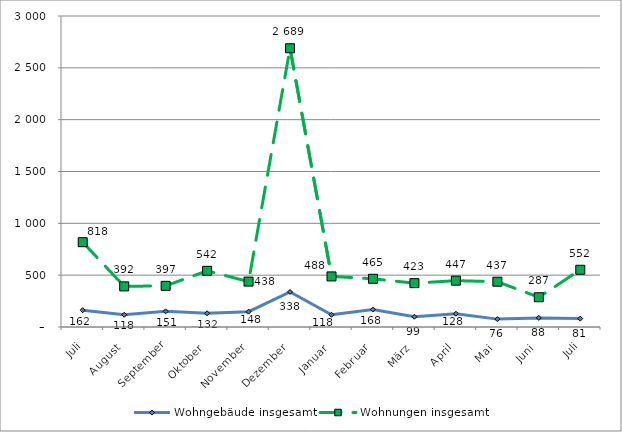
| Category | Wohngebäude insgesamt | Wohnungen insgesamt |
|---|---|---|
| Juli | 162 | 818 |
| August | 118 | 392 |
| September | 151 | 397 |
| Oktober | 132 | 542 |
| November | 148 | 438 |
| Dezember | 338 | 2689 |
| Januar | 118 | 488 |
| Februar | 168 | 465 |
| März | 99 | 423 |
| April | 128 | 447 |
| Mai | 76 | 437 |
| Juni | 88 | 287 |
| Juli | 81 | 552 |